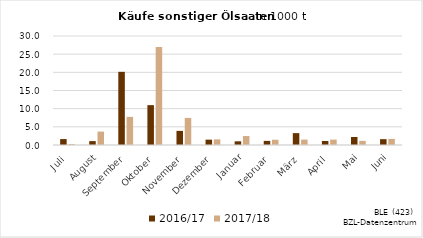
| Category | 2016/17 | 2017/18 |
|---|---|---|
| Juli | 1.631 | 0.266 |
| August | 1.072 | 3.687 |
| September | 20.134 | 7.739 |
| Oktober | 10.971 | 26.974 |
| November | 3.887 | 7.461 |
| Dezember | 1.472 | 1.55 |
| Januar | 1.016 | 2.466 |
| Februar | 1.131 | 1.449 |
| März | 3.269 | 1.486 |
| April | 1.102 | 1.484 |
| Mai | 2.207 | 1.136 |
| Juni | 1.607 | 1.682 |